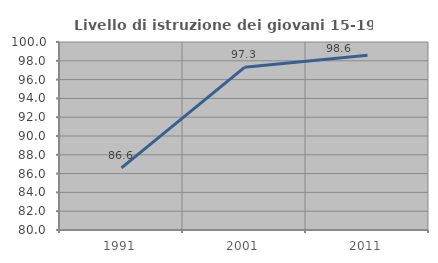
| Category | Livello di istruzione dei giovani 15-19 anni |
|---|---|
| 1991.0 | 86.604 |
| 2001.0 | 97.309 |
| 2011.0 | 98.598 |